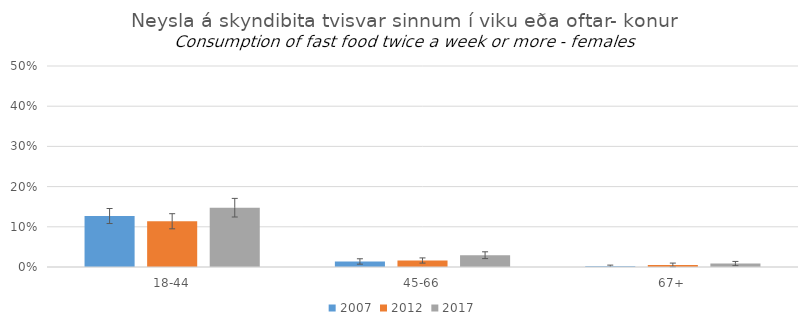
| Category | 2007 | 2012 | 2017 |
|---|---|---|---|
| 18-44 | 0.127 | 0.114 | 0.148 |
| 45-66 | 0.014 | 0.016 | 0.029 |
| 67+ | 0.002 | 0.005 | 0.009 |